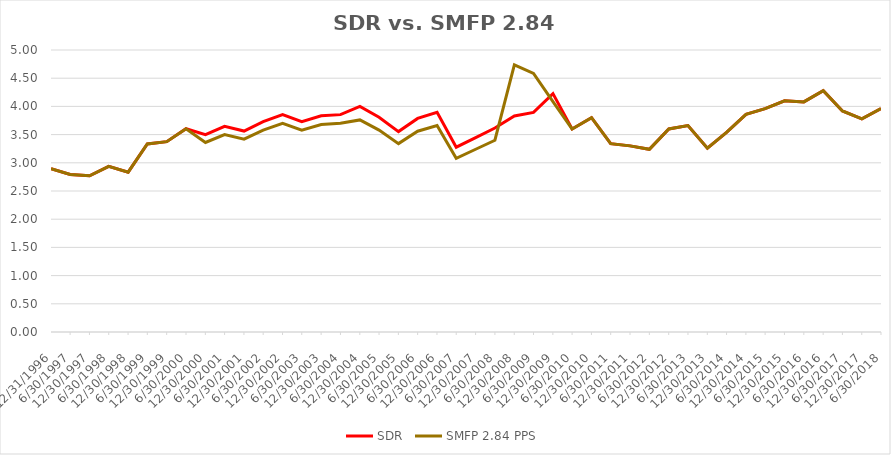
| Category | SDR | SMFP 2.84 PPS |
|---|---|---|
| 12/31/96 | 2.896 | 2.896 |
| 6/30/97 | 2.792 | 2.792 |
| 12/31/97 | 2.771 | 2.771 |
| 6/30/98 | 2.938 | 2.938 |
| 12/31/98 | 2.833 | 2.833 |
| 6/30/99 | 3.333 | 3.333 |
| 12/31/99 | 3.375 | 3.375 |
| 6/30/00 | 3.604 | 3.604 |
| 12/31/00 | 3.5 | 3.36 |
| 6/30/01 | 3.646 | 3.5 |
| 12/31/01 | 3.562 | 3.42 |
| 6/30/02 | 3.729 | 3.58 |
| 12/31/02 | 3.854 | 3.7 |
| 6/30/03 | 3.729 | 3.58 |
| 12/31/03 | 3.833 | 3.68 |
| 6/30/04 | 3.854 | 3.7 |
| 12/31/04 | 4 | 3.76 |
| 6/30/05 | 3.809 | 3.58 |
| 12/31/05 | 3.553 | 3.34 |
| 6/30/06 | 3.787 | 3.56 |
| 12/31/06 | 3.894 | 3.66 |
| 6/30/07 | 3.277 | 3.08 |
| 12/31/07 | 3.447 | 3.24 |
| 6/30/08 | 3.617 | 3.4 |
| 12/31/08 | 3.83 | 4.736 |
| 6/30/09 | 3.894 | 4.584 |
| 12/31/09 | 4.227 | 4.086 |
| 6/30/10 | 3.6 | 3.6 |
| 12/31/10 | 3.8 | 3.8 |
| 6/30/11 | 3.34 | 3.34 |
| 12/31/11 | 3.3 | 3.3 |
| 6/30/12 | 3.24 | 3.24 |
| 12/31/12 | 3.6 | 3.6 |
| 6/30/13 | 3.66 | 3.66 |
| 12/31/13 | 3.26 | 3.26 |
| 6/30/14 | 3.54 | 3.54 |
| 12/31/14 | 3.86 | 3.86 |
| 6/30/15 | 3.96 | 3.96 |
| 12/31/15 | 4.1 | 4.1 |
| 6/30/16 | 4.08 | 4.08 |
| 12/31/16 | 4.28 | 4.28 |
| 6/30/17 | 3.92 | 3.92 |
| 12/31/17 | 3.78 | 3.78 |
| 6/30/18 | 3.96 | 3.96 |